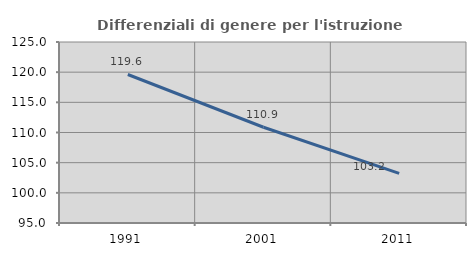
| Category | Differenziali di genere per l'istruzione superiore |
|---|---|
| 1991.0 | 119.614 |
| 2001.0 | 110.874 |
| 2011.0 | 103.226 |